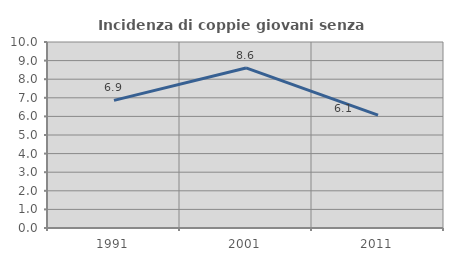
| Category | Incidenza di coppie giovani senza figli |
|---|---|
| 1991.0 | 6.862 |
| 2001.0 | 8.606 |
| 2011.0 | 6.07 |